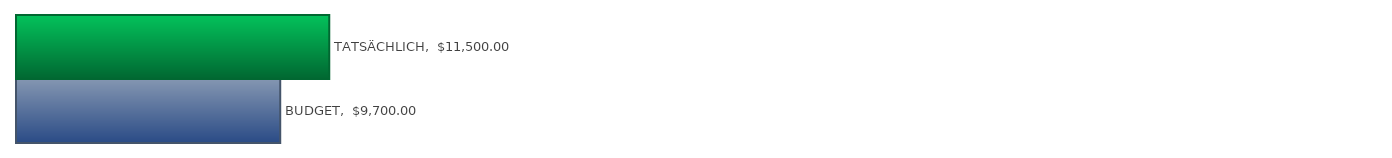
| Category | Series 0 |
|---|---|
| BUDGET | 9700 |
| TATSÄCHLICH | 11500 |